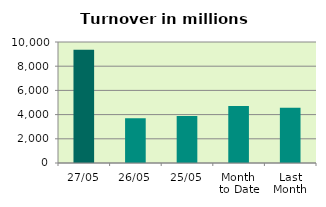
| Category | Series 0 |
|---|---|
| 27/05 | 9351.071 |
| 26/05 | 3699.18 |
| 25/05 | 3881.264 |
| Month 
to Date | 4718.848 |
| Last
Month | 4573.802 |